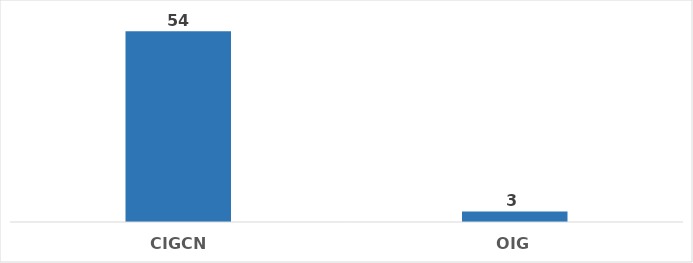
| Category | Total |
|---|---|
| CIGCN | 54 |
| OIG | 3 |